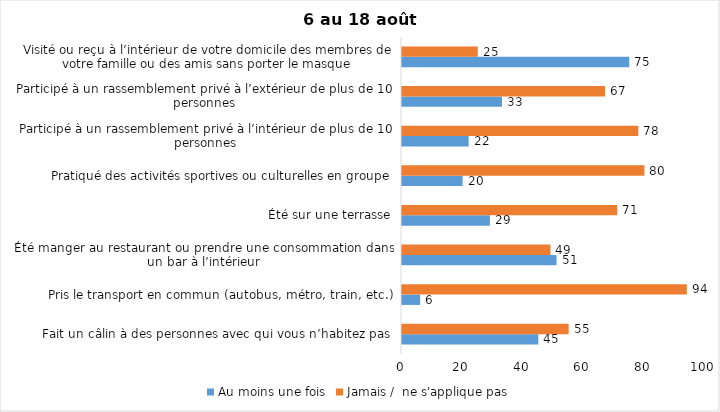
| Category | Au moins une fois | Jamais /  ne s'applique pas |
|---|---|---|
| Fait un câlin à des personnes avec qui vous n’habitez pas | 45 | 55 |
| Pris le transport en commun (autobus, métro, train, etc.) | 6 | 94 |
| Été manger au restaurant ou prendre une consommation dans un bar à l’intérieur | 51 | 49 |
| Été sur une terrasse | 29 | 71 |
| Pratiqué des activités sportives ou culturelles en groupe | 20 | 80 |
| Participé à un rassemblement privé à l’intérieur de plus de 10 personnes | 22 | 78 |
| Participé à un rassemblement privé à l’extérieur de plus de 10 personnes | 33 | 67 |
| Visité ou reçu à l’intérieur de votre domicile des membres de votre famille ou des amis sans porter le masque | 75 | 25 |